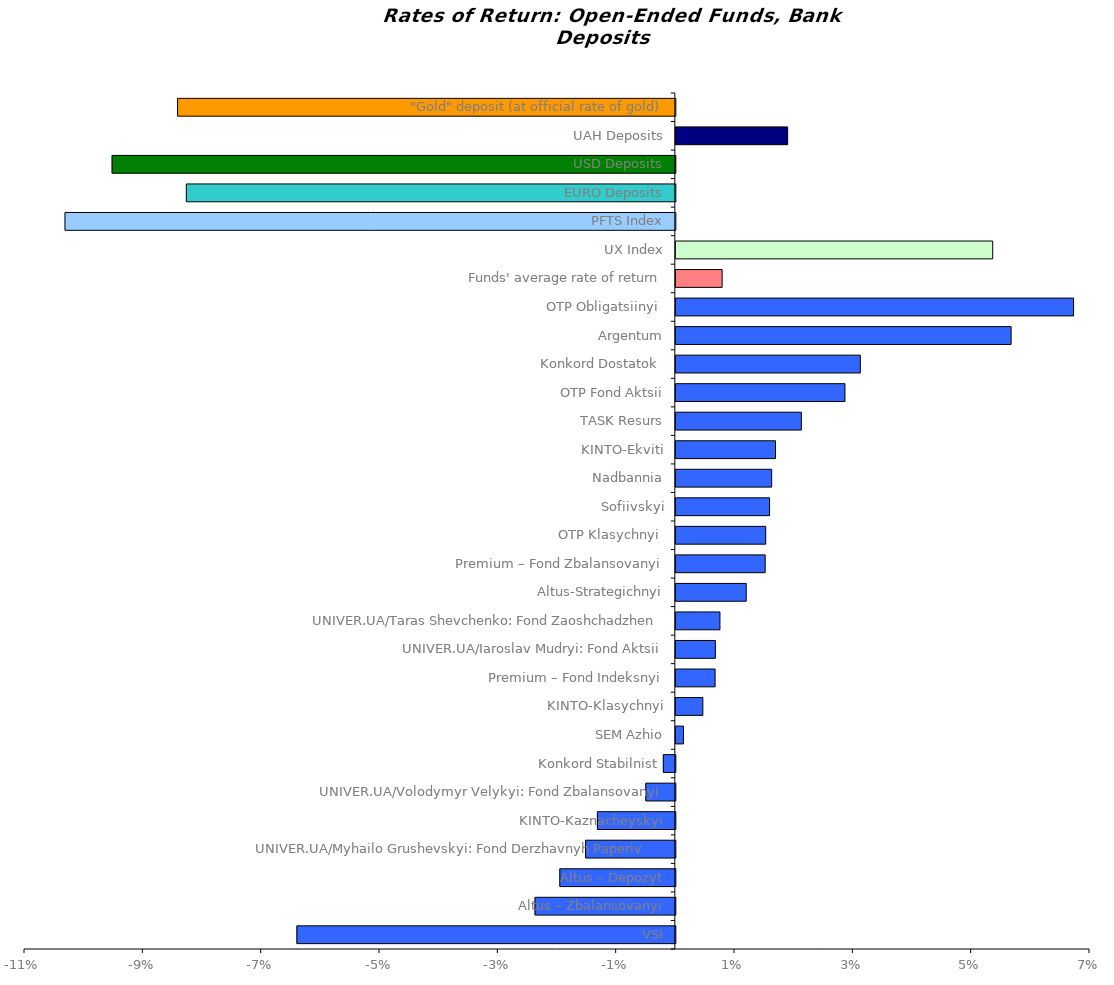
| Category | Series 0 |
|---|---|
| VSI | -0.064 |
| Altus – Zbalansovanyi | -0.024 |
| Altus – Depozyt | -0.02 |
| UNIVER.UA/Myhailo Grushevskyi: Fond Derzhavnyh Paperiv    | -0.015 |
| KINTO-Kaznacheyskyi | -0.013 |
| UNIVER.UA/Volodymyr Velykyi: Fond Zbalansovanyi | -0.005 |
| Konkord Stabilnist  | -0.002 |
| SEM Azhio | 0.001 |
| KINTO-Klasychnyi | 0.005 |
| Premium – Fond Indeksnyi | 0.007 |
| UNIVER.UA/Iaroslav Mudryi: Fond Aktsii | 0.007 |
| UNIVER.UA/Taras Shevchenko: Fond Zaoshchadzhen | 0.007 |
| Altus-Strategichnyi | 0.012 |
| Premium – Fond Zbalansovanyi | 0.015 |
| OTP Klasychnyi  | 0.015 |
| Sofiivskyi | 0.016 |
| Nadbannia | 0.016 |
| KINTO-Ekviti | 0.017 |
| TASK Resurs | 0.021 |
| OTP Fond Aktsii | 0.029 |
| Konkord Dostatok  | 0.031 |
| Argentum | 0.057 |
| OTP Obligatsiinyi  | 0.067 |
| Funds' average rate of return | 0.008 |
| UX Index | 0.054 |
| PFTS Index | -0.103 |
| EURO Deposits | -0.083 |
| USD Deposits | -0.095 |
| UAH Deposits | 0.019 |
| "Gold" deposit (at official rate of gold) | -0.084 |